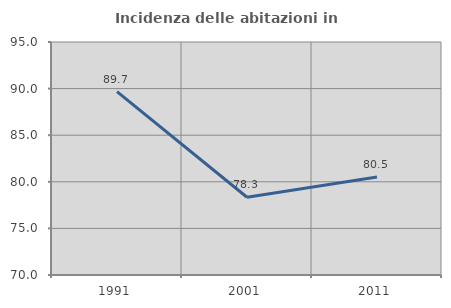
| Category | Incidenza delle abitazioni in proprietà  |
|---|---|
| 1991.0 | 89.677 |
| 2001.0 | 78.344 |
| 2011.0 | 80.526 |